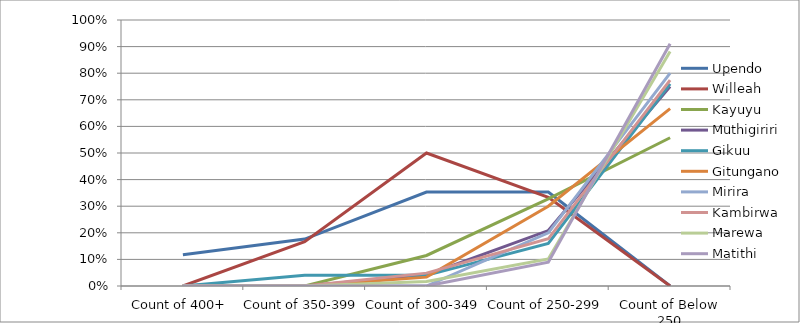
| Category | Upendo | Willeah | Kayuyu | Muthigiriri | Gikuu | Gitungano | Mirira | Kambirwa | Marewa | Matithi |
|---|---|---|---|---|---|---|---|---|---|---|
| Count of 400+ | 0.118 | 0 | 0 | 0 | 0 | 0 | 0 | 0 | 0 | 0 |
| Count of 350-399 | 0.176 | 0.167 | 0 | 0 | 0.04 | 0 | 0 | 0 | 0 | 0 |
| Count of 300-349 | 0.353 | 0.5 | 0.115 | 0.042 | 0.04 | 0.033 | 0 | 0.048 | 0.017 | 0 |
| Count of 250-299 | 0.353 | 0.333 | 0.328 | 0.208 | 0.16 | 0.3 | 0.2 | 0.177 | 0.102 | 0.089 |
| Count of Below 250 | 0 | 0 | 0.557 | 0.75 | 0.76 | 0.667 | 0.8 | 0.774 | 0.881 | 0.911 |